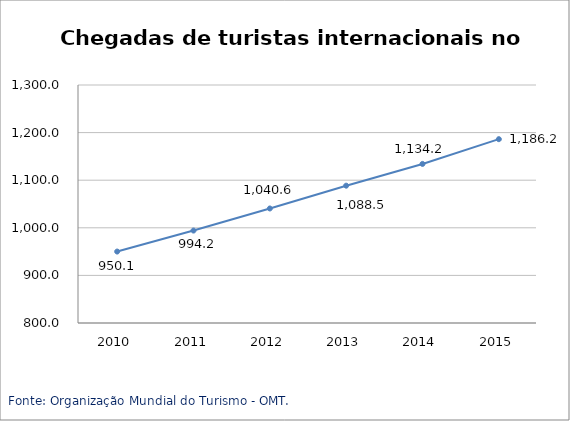
| Category | Mundo |
|---|---|
| 2010.0 | 950.1 |
| 2011.0 | 994.2 |
| 2012.0 | 1040.6 |
| 2013.0 | 1088.5 |
| 2014.0 | 1134.2 |
| 2015.0 | 1186.2 |